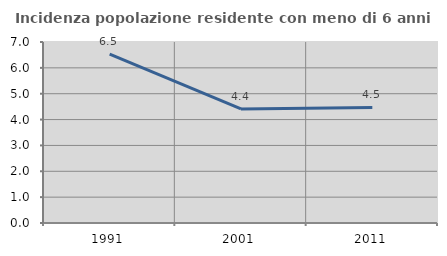
| Category | Incidenza popolazione residente con meno di 6 anni |
|---|---|
| 1991.0 | 6.534 |
| 2001.0 | 4.412 |
| 2011.0 | 4.469 |